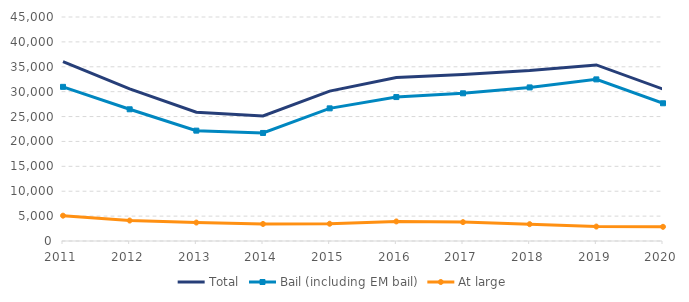
| Category | Total | Bail (including EM bail) | At large |
|---|---|---|---|
| 2011.0 | 36055 | 30966 | 5089 |
| 2012.0 | 30568 | 26459 | 4109 |
| 2013.0 | 25875 | 22171 | 3704 |
| 2014.0 | 25128 | 21704 | 3424 |
| 2015.0 | 30111 | 26647 | 3464 |
| 2016.0 | 32846 | 28916 | 3930 |
| 2017.0 | 33463 | 29670 | 3793 |
| 2018.0 | 34237 | 30854 | 3383 |
| 2019.0 | 35368 | 32468 | 2900 |
| 2020.0 | 30517 | 27667 | 2850 |